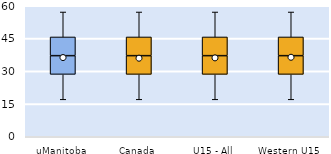
| Category | 25th | 50th | 75th |
|---|---|---|---|
| uManitoba | 28.571 | 8.571 | 8.571 |
| Canada | 28.571 | 8.571 | 8.571 |
| U15 - All | 28.571 | 8.571 | 8.571 |
| Western U15 | 28.571 | 8.571 | 8.571 |